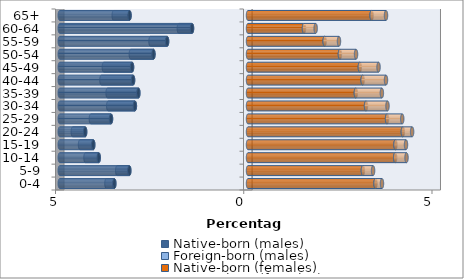
| Category | Native-born (males) | Foreign-born (males) | Native-born (females) | Foreign-born (females) |
|---|---|---|---|---|
| 0-4 | -3.551 | -0.21 | 3.387 | 0.172 |
| 5-9 | -3.153 | -0.321 | 3.052 | 0.271 |
| 10-14 | -3.965 | -0.351 | 3.909 | 0.302 |
| 15-19 | -4.11 | -0.351 | 3.916 | 0.281 |
| 20-24 | -4.325 | -0.328 | 4.113 | 0.246 |
| 25-29 | -3.639 | -0.535 | 3.693 | 0.404 |
| 30-34 | -3.004 | -0.708 | 3.135 | 0.57 |
| 35-39 | -2.912 | -0.817 | 2.865 | 0.691 |
| 40-44 | -3.052 | -0.841 | 3.045 | 0.62 |
| 45-49 | -3.08 | -0.749 | 2.971 | 0.497 |
| 50-54 | -2.511 | -0.601 | 2.442 | 0.428 |
| 55-59 | -2.149 | -0.441 | 2.036 | 0.381 |
| 60-64 | -1.487 | -0.351 | 1.487 | 0.311 |
| 65+ | -3.147 | -0.42 | 3.284 | 0.382 |